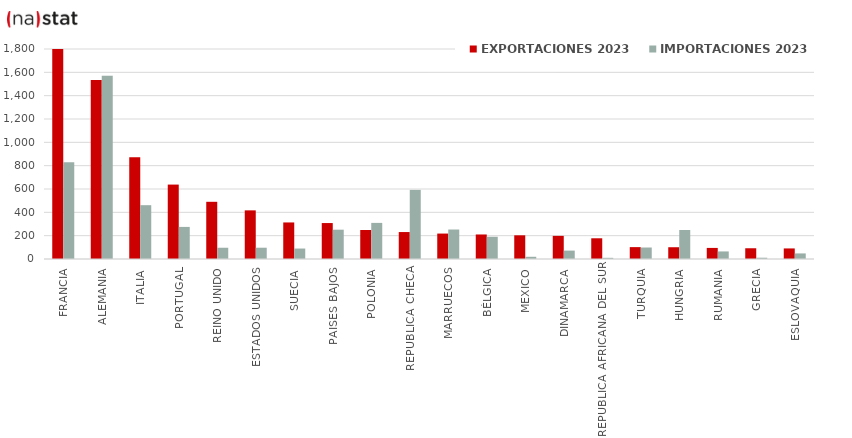
| Category | EXPORTACIONES 2023 | IMPORTACIONES 2023 |
|---|---|---|
| FRANCIA | 2064.204 | 828.754 |
| ALEMANIA | 1534.473 | 1571.436 |
| ITALIA | 871.962 | 461.286 |
| PORTUGAL | 637.859 | 275.018 |
| REINO UNIDO | 490.262 | 96.48 |
| ESTADOS UNIDOS | 416.84 | 96.666 |
| SUECIA | 313.305 | 89.708 |
| PAISES BAJOS | 308.106 | 251.282 |
| POLONIA | 248.575 | 309.502 |
| REPUBLICA CHECA | 230.985 | 592.536 |
| MARRUECOS | 218.015 | 252.688 |
| BÉLGICA | 210.17 | 190.738 |
| MEXICO | 203.158 | 18.97 |
| DINAMARCA | 198.223 | 72.087 |
| REPUBLICA AFRICANA DEL SUR | 177.622 | 10.15 |
| TURQUIA | 101.75 | 98.462 |
| HUNGRIA | 100.85 | 248.673 |
| RUMANIA | 94.951 | 64.895 |
| GRECIA | 92.089 | 10.93 |
| ESLOVAQUIA | 90.563 | 47.77 |